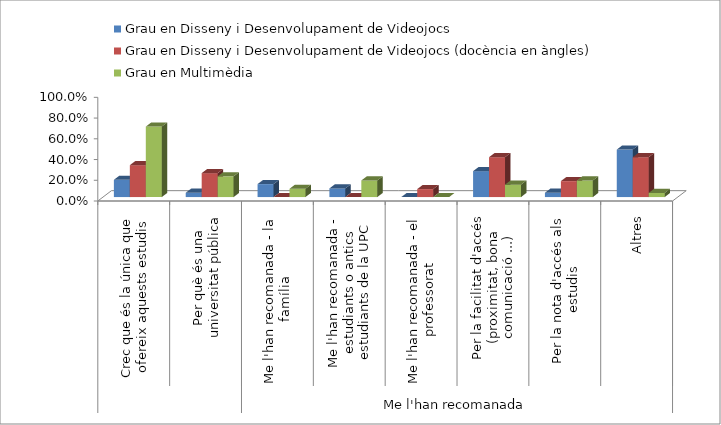
| Category | Grau en Disseny i Desenvolupament de Videojocs | Grau en Disseny i Desenvolupament de Videojocs (docència en àngles) | Grau en Multimèdia |
|---|---|---|---|
| 0 | 0.167 | 0.308 | 0.68 |
| 1 | 0.042 | 0.231 | 0.2 |
| 2 | 0.125 | 0 | 0.08 |
| 3 | 0.083 | 0 | 0.16 |
| 4 | 0 | 0.077 | 0 |
| 5 | 0.25 | 0.385 | 0.12 |
| 6 | 0.042 | 0.154 | 0.16 |
| 7 | 0.458 | 0.385 | 0.04 |